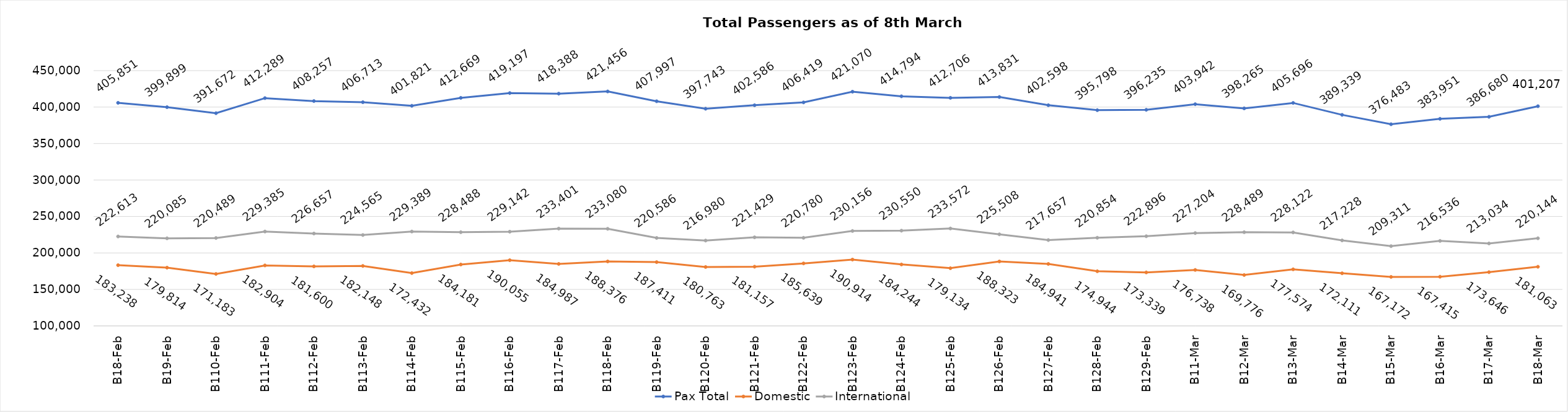
| Category | Pax Total | Domestic | International |
|---|---|---|---|
| 2024-02-08 | 405851 | 183238 | 222613 |
| 2024-02-09 | 399899 | 179814 | 220085 |
| 2024-02-10 | 391672 | 171183 | 220489 |
| 2024-02-11 | 412289 | 182904 | 229385 |
| 2024-02-12 | 408257 | 181600 | 226657 |
| 2024-02-13 | 406713 | 182148 | 224565 |
| 2024-02-14 | 401821 | 172432 | 229389 |
| 2024-02-15 | 412669 | 184181 | 228488 |
| 2024-02-16 | 419197 | 190055 | 229142 |
| 2024-02-17 | 418388 | 184987 | 233401 |
| 2024-02-18 | 421456 | 188376 | 233080 |
| 2024-02-19 | 407997 | 187411 | 220586 |
| 2024-02-20 | 397743 | 180763 | 216980 |
| 2024-02-21 | 402586 | 181157 | 221429 |
| 2024-02-22 | 406419 | 185639 | 220780 |
| 2024-02-23 | 421070 | 190914 | 230156 |
| 2024-02-24 | 414794 | 184244 | 230550 |
| 2024-02-25 | 412706 | 179134 | 233572 |
| 2024-02-26 | 413831 | 188323 | 225508 |
| 2024-02-27 | 402598 | 184941 | 217657 |
| 2024-02-28 | 395798 | 174944 | 220854 |
| 2024-02-29 | 396235 | 173339 | 222896 |
| 2024-03-01 | 403942 | 176738 | 227204 |
| 2024-03-02 | 398265 | 169776 | 228489 |
| 2024-03-03 | 405696 | 177574 | 228122 |
| 2024-03-04 | 389339 | 172111 | 217228 |
| 2024-03-05 | 376483 | 167172 | 209311 |
| 2024-03-06 | 383951 | 167415 | 216536 |
| 2024-03-07 | 386680 | 173646 | 213034 |
| 2024-03-08 | 401207 | 181063 | 220144 |